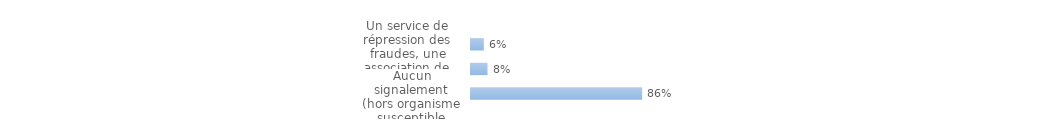
| Category | Series 0 |
|---|---|
| Un service de répression des fraudes, une association de consommateurs ou un service juridique (avocat, huissier, société de recouvrement,…) | 0.064 |
| Un autre interlocuteur (dont police municipale, justice, élu, ...) | 0.083 |
| Aucun signalement (hors organisme susceptible d'indemniser) | 0.86 |